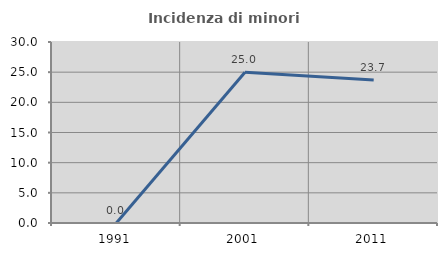
| Category | Incidenza di minori stranieri |
|---|---|
| 1991.0 | 0 |
| 2001.0 | 25 |
| 2011.0 | 23.711 |